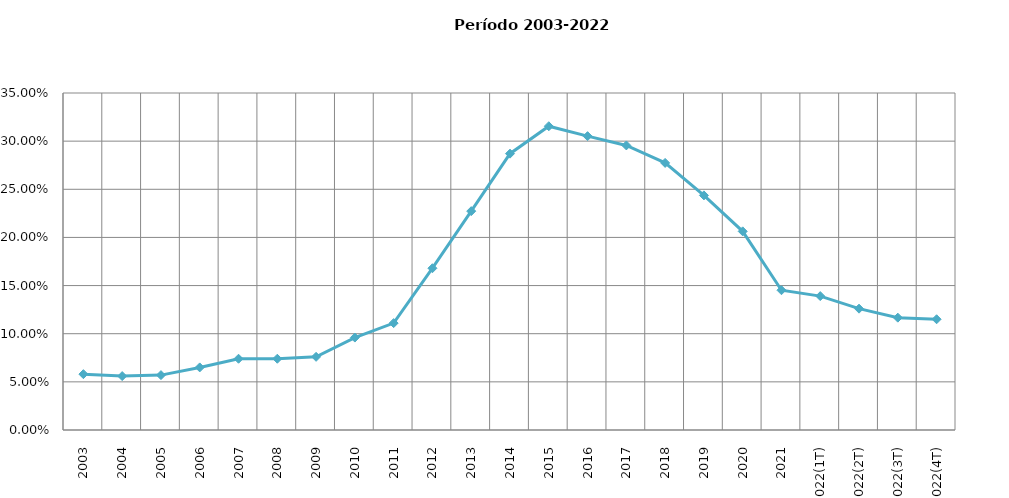
| Category | Grado estimado de penetración del servicio |
|---|---|
| 2003 | 0.058 |
| 2004 | 0.056 |
| 2005 | 0.057 |
| 2006 | 0.065 |
| 2007 | 0.074 |
| 2008 | 0.074 |
| 2009 | 0.076 |
| 2010 | 0.096 |
| 2011 | 0.111 |
| 2012 | 0.168 |
| 2013 | 0.227 |
| 2014 | 0.287 |
| 2015 | 0.315 |
| 2016 | 0.305 |
| 2017 | 0.296 |
| 2018 | 0.277 |
| 2019 | 0.244 |
| 2020 | 0.206 |
| 2021 | 0.145 |
| 2022(1T) | 0.139 |
| 2022(2T) | 0.126 |
| 2022(3T) | 0.117 |
| 2022(4T) | 0.115 |